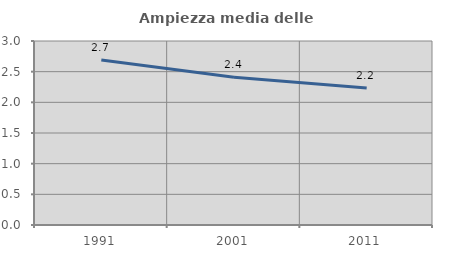
| Category | Ampiezza media delle famiglie |
|---|---|
| 1991.0 | 2.69 |
| 2001.0 | 2.409 |
| 2011.0 | 2.233 |